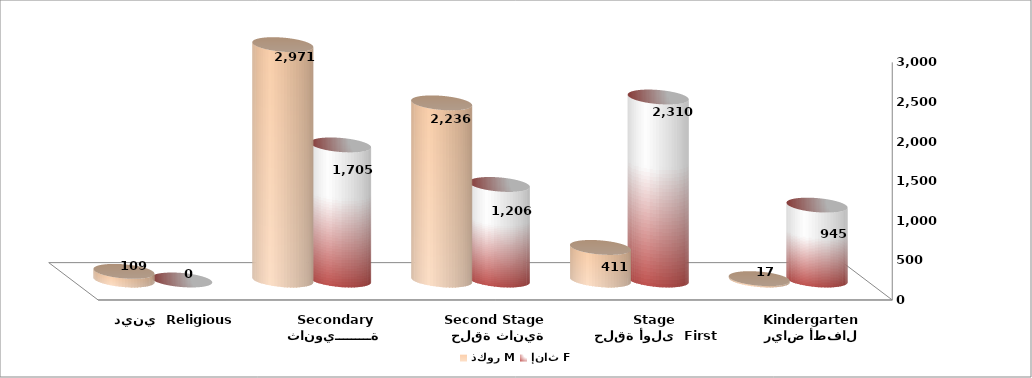
| Category | ذكور M | إناث F |
|---|---|---|
| رياض أطفال Kindergarten | 17 | 945 |
|  حلقة أولى  First Stage | 411 | 2310 |
|   حلقة ثانية  Second Stage | 2236 | 1206 |
| ثانويـــــــــة Secondary | 2971 | 1705 |
| ديني  Religious | 109 | 0 |